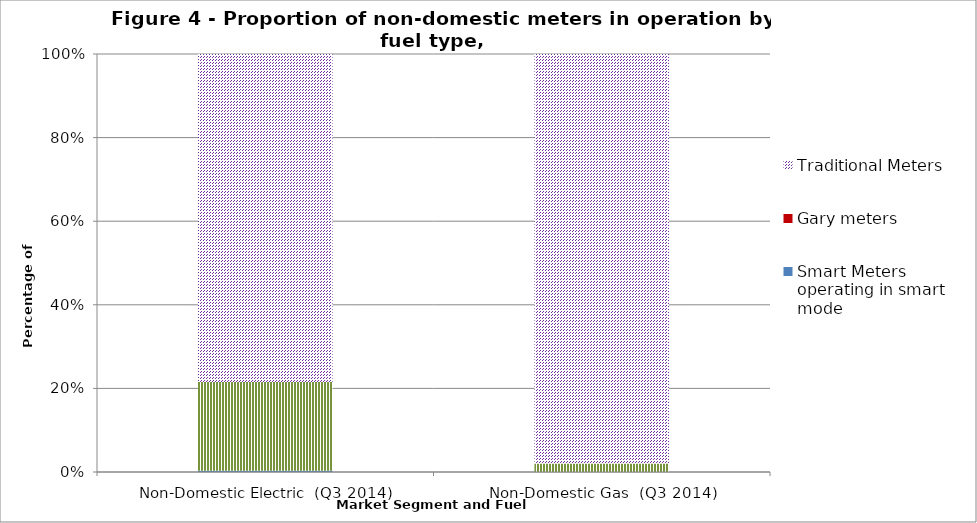
| Category | Smart Meters operating in smart mode | Gary meters | Advanced Meters | Traditional Meters |
|---|---|---|---|---|
| Non-Domestic Electric  (Q3 2014) | 6214 | 0 | 477395 | 1763237 |
| Non-Domestic Gas  (Q3 2014) | 0 | 0 | 10078 | 484537 |